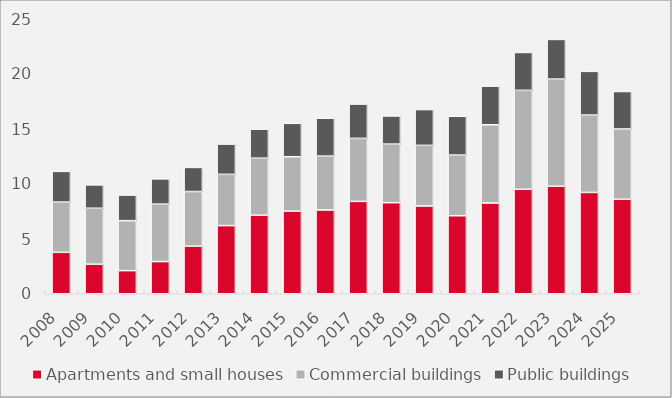
| Category | Apartments and small houses | Commercial buildings | Public buildings |
|---|---|---|---|
| 2008.0 | 3.767 | 4.567 | 2.792 |
| 2009.0 | 2.686 | 5.086 | 2.125 |
| 2010.0 | 2.104 | 4.541 | 2.331 |
| 2011.0 | 2.925 | 5.226 | 2.294 |
| 2012.0 | 4.327 | 4.964 | 2.193 |
| 2013.0 | 6.197 | 4.659 | 2.75 |
| 2014.0 | 7.14 | 5.183 | 2.643 |
| 2015.0 | 7.509 | 4.95 | 3.035 |
| 2016.0 | 7.615 | 4.899 | 3.447 |
| 2017.0 | 8.396 | 5.73 | 3.118 |
| 2018.0 | 8.281 | 5.324 | 2.558 |
| 2019.0 | 7.98 | 5.511 | 3.253 |
| 2020.0 | 7.095 | 5.511 | 3.529 |
| 2021.0 | 8.252 | 7.11 | 3.514 |
| 2022.0 | 9.498 | 8.994 | 3.443 |
| 2023.0 | 9.774 | 9.741 | 3.607 |
| 2024.0 | 9.21 | 7.033 | 3.975 |
| 2025.0 | 8.589 | 6.39 | 3.406 |